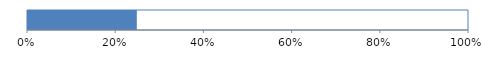
| Category | Series 0 |
|---|---|
| 0 | 0.247 |